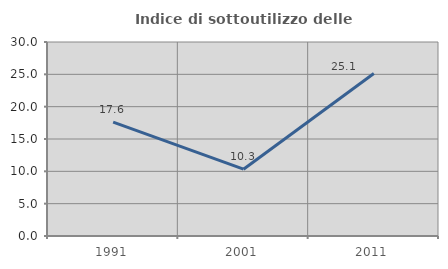
| Category | Indice di sottoutilizzo delle abitazioni  |
|---|---|
| 1991.0 | 17.603 |
| 2001.0 | 10.331 |
| 2011.0 | 25.118 |